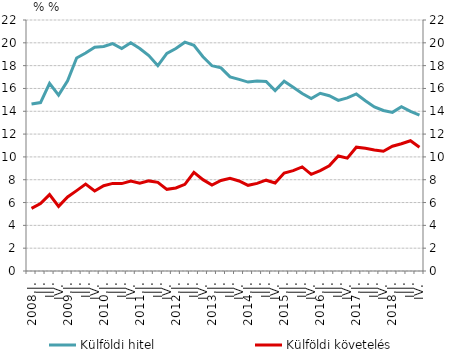
| Category | Külföldi hitel |
|---|---|
| 2008.I. | 14.631 |
| II. | 14.765 |
| III. | 16.451 |
| IV. | 15.419 |
| 2009.I. | 16.679 |
| II. | 18.674 |
| III. | 19.102 |
| IV. | 19.621 |
| 2010.I. | 19.678 |
| II. | 19.929 |
| III. | 19.504 |
| IV. | 20.005 |
| 2011.I. | 19.504 |
| II. | 18.884 |
| III. | 17.991 |
| IV. | 19.071 |
| 2012.I. | 19.498 |
| II. | 20.056 |
| III. | 19.776 |
| IV. | 18.782 |
| 2013.I. | 17.989 |
| II. | 17.803 |
| III. | 17.019 |
| IV. | 16.797 |
| 2014.I. | 16.56 |
| II. | 16.661 |
| III. | 16.606 |
| IV. | 15.812 |
| 2015.I. | 16.632 |
| II. | 16.096 |
| III. | 15.552 |
| IV. | 15.116 |
| 2016.I. | 15.579 |
| II. | 15.366 |
| III. | 14.951 |
| IV. | 15.178 |
| 2017.I. | 15.52 |
| II. | 14.924 |
| III. | 14.384 |
| IV. | 14.069 |
| 2018.I. | 13.905 |
| II. | 14.406 |
| III. | 13.989 |
| IV. | 13.669 |